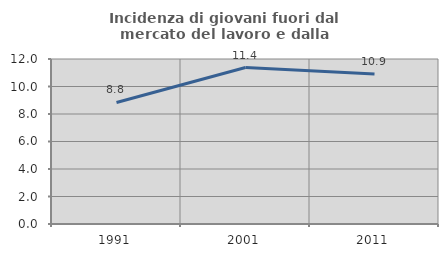
| Category | Incidenza di giovani fuori dal mercato del lavoro e dalla formazione  |
|---|---|
| 1991.0 | 8.841 |
| 2001.0 | 11.379 |
| 2011.0 | 10.909 |